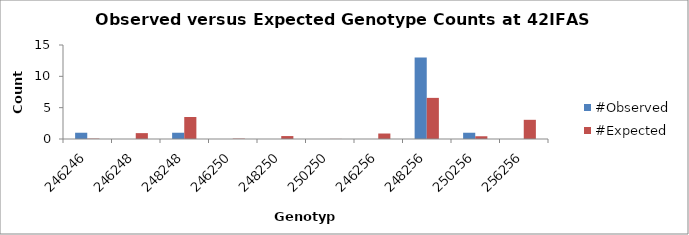
| Category | #Observed | #Expected |
|---|---|---|
| 246246.0 | 1 | 0.062 |
| 246248.0 | 0 | 0.938 |
| 248248.0 | 1 | 3.516 |
| 246250.0 | 0 | 0.062 |
| 248250.0 | 0 | 0.469 |
| 250250.0 | 0 | 0.016 |
| 246256.0 | 0 | 0.875 |
| 248256.0 | 13 | 6.562 |
| 250256.0 | 1 | 0.438 |
| 256256.0 | 0 | 3.062 |